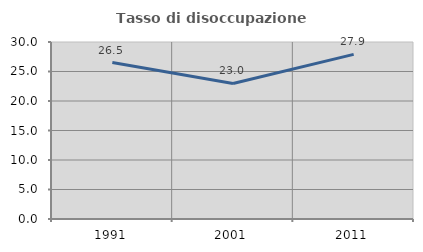
| Category | Tasso di disoccupazione giovanile  |
|---|---|
| 1991.0 | 26.515 |
| 2001.0 | 22.973 |
| 2011.0 | 27.907 |